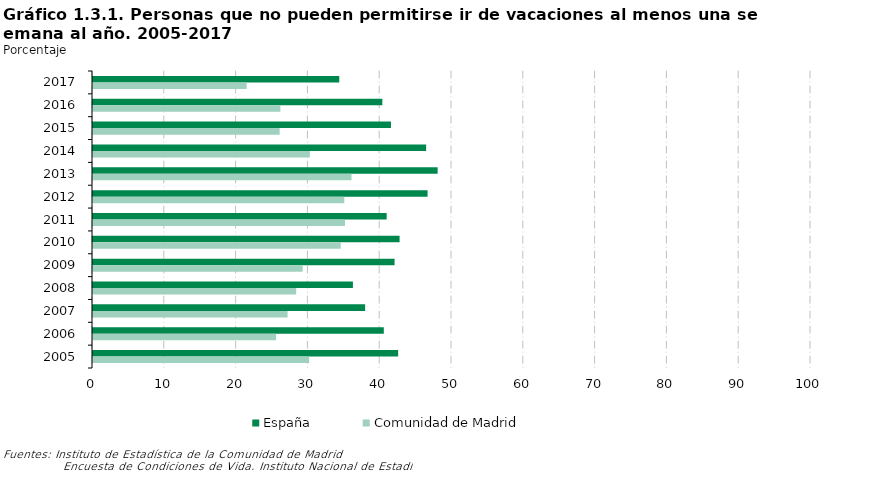
| Category | España | Comunidad de Madrid |
|---|---|---|
| 2017 | 34.3 | 21.4 |
| 2016 | 40.3 | 26.1 |
| 2015 | 41.5 | 26 |
| 2014 | 46.4 | 30.2 |
| 2013 | 48 | 36 |
| 2012 | 46.6 | 35 |
| 2011 | 40.9 | 35.1 |
| 2010 | 42.7 | 34.5 |
| 2009 | 42 | 29.2 |
| 2008 | 36.2 | 28.3 |
| 2007 | 37.9 | 27.1 |
| 2006 | 40.5 | 25.5 |
| 2005 | 42.5 | 30.1 |